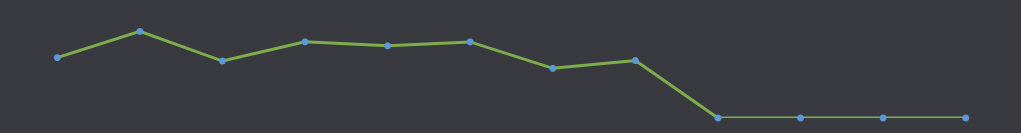
| Category | Διαθέσιμα μετρητά |
|---|---|
| ΙΑΝ | 820 |
| ΦΕΒ | 1177 |
| ΜΑΡ | 774 |
| ΑΠΡ | 1035 |
| ΜΑΪΟΣ | 981 |
| ΙΟΥΝ | 1034 |
| ΙΟΥΛ | 675 |
| ΑΥΓ | 781 |
| ΣΕΠ | 0 |
| ΟΚΤ | 0 |
| ΝΟΕ | 0 |
| ΔΕΚ | 0 |